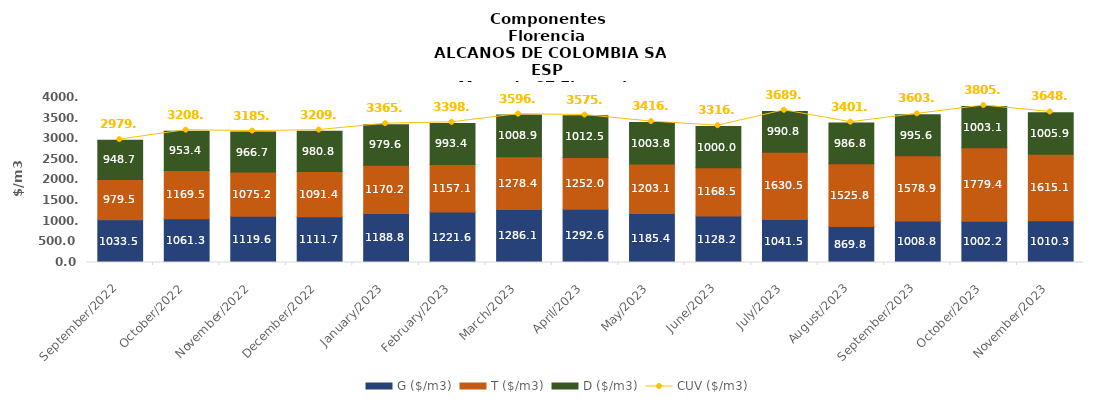
| Category | G ($/m3) | T ($/m3) | D ($/m3) |
|---|---|---|---|
| 2022-09-01 | 1033.47 | 979.51 | 948.67 |
| 2022-10-01 | 1061.27 | 1169.53 | 953.42 |
| 2022-11-01 | 1119.61 | 1075.19 | 966.69 |
| 2022-12-01 | 1111.69 | 1091.36 | 980.8 |
| 2023-01-01 | 1188.81 | 1170.15 | 979.57 |
| 2023-02-01 | 1221.59 | 1157.08 | 993.4 |
| 2023-03-01 | 1286.09 | 1278.38 | 1008.86 |
| 2023-04-01 | 1292.6 | 1251.95 | 1012.48 |
| 2023-05-01 | 1185.42 | 1203.07 | 1003.78 |
| 2023-06-01 | 1128.21 | 1168.47 | 999.96 |
| 2023-07-01 | 1041.54 | 1630.51 | 990.77 |
| 2023-08-01 | 869.82 | 1525.81 | 986.78 |
| 2023-09-01 | 1008.82 | 1578.87 | 995.55 |
| 2023-10-01 | 1002.24 | 1779.41 | 1003.05 |
| 2023-11-01 | 1010.34 | 1615.11 | 1005.88 |